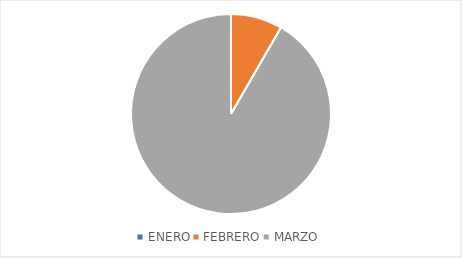
| Category | Series 0 |
|---|---|
| ENERO | 0 |
| FEBRERO | 1 |
| MARZO | 11 |